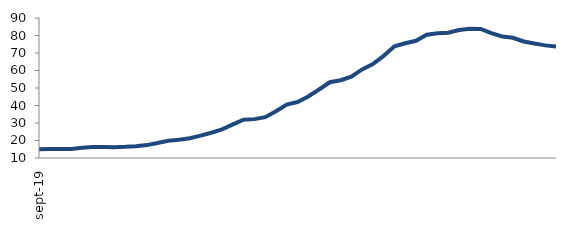
| Category | Series 0 |
|---|---|
| 2019-09-01 | 15.056 |
| 2019-10-01 | 15.116 |
| 2019-11-01 | 15.185 |
| 2019-12-01 | 15.165 |
| 2020-01-01 | 15.917 |
| 2020-02-01 | 16.225 |
| 2020-03-01 | 16.228 |
| 2020-04-01 | 16.172 |
| 2020-05-01 | 16.362 |
| 2020-06-01 | 16.723 |
| 2020-07-01 | 17.365 |
| 2020-08-01 | 18.526 |
| 2020-09-01 | 19.846 |
| 2020-10-01 | 20.404 |
| 2020-11-01 | 21.294 |
| 2020-12-01 | 22.781 |
| 2021-01-01 | 24.447 |
| 2021-02-01 | 26.406 |
| 2021-03-01 | 29.172 |
| 2021-04-01 | 31.839 |
| 2021-05-01 | 32.208 |
| 2021-06-01 | 33.334 |
| 2021-07-01 | 36.745 |
| 2021-08-01 | 40.523 |
| 2021-09-01 | 41.963 |
| 2021-10-01 | 45.141 |
| 2021-11-01 | 49.115 |
| 2021-12-01 | 53.284 |
| 2022-01-01 | 54.418 |
| 2022-02-01 | 56.487 |
| 2022-03-01 | 60.62 |
| 2022-04-01 | 63.634 |
| 2022-05-01 | 68.377 |
| 2022-06-01 | 73.83 |
| 2022-07-01 | 75.57 |
| 2022-08-01 | 76.97 |
| 2022-09-01 | 80.415 |
| 2022-10-01 | 81.287 |
| 2022-11-01 | 81.539 |
| 2022-12-01 | 83.165 |
| 2023-01-01 | 83.881 |
| 2023-02-01 | 83.774 |
| 2023-03-01 | 81.297 |
| 2023-04-01 | 79.408 |
| 2023-05-01 | 78.7 |
| 2023-06-01 | 76.589 |
| 2023-07-01 | 75.386 |
| 2023-08-01 | 74.364 |
| 2023-09-01 | 73.686 |